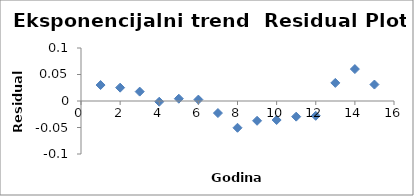
| Category | Series 0 |
|---|---|
| 1.0 | 0.03 |
| 2.0 | 0.025 |
| 3.0 | 0.018 |
| 4.0 | -0.001 |
| 5.0 | 0.004 |
| 6.0 | 0.003 |
| 7.0 | -0.023 |
| 8.0 | -0.05 |
| 9.0 | -0.037 |
| 10.0 | -0.036 |
| 11.0 | -0.03 |
| 12.0 | -0.028 |
| 13.0 | 0.034 |
| 14.0 | 0.06 |
| 15.0 | 0.031 |